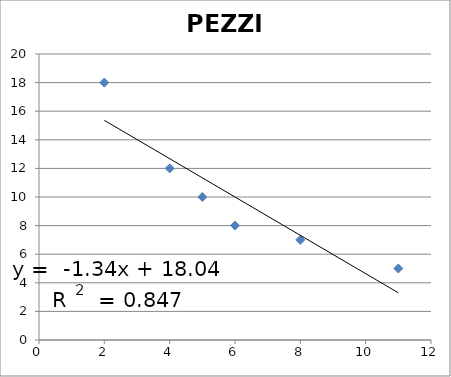
| Category | PEZZI |
|---|---|
| 2.0 | 18 |
| 4.0 | 12 |
| 5.0 | 10 |
| 6.0 | 8 |
| 8.0 | 7 |
| 11.0 | 5 |